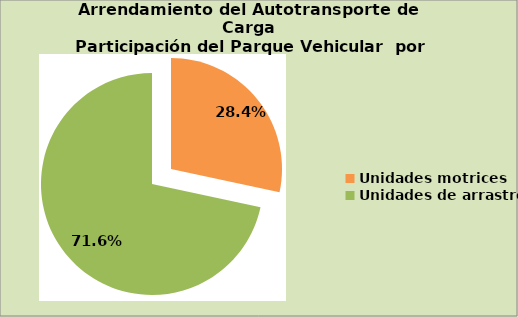
| Category | Series 0 |
|---|---|
| Unidades motrices | 28.366 |
| Unidades de arrastre | 71.634 |